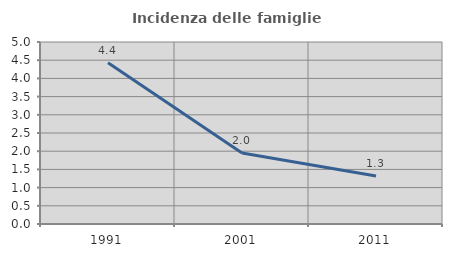
| Category | Incidenza delle famiglie numerose |
|---|---|
| 1991.0 | 4.43 |
| 2001.0 | 1.951 |
| 2011.0 | 1.316 |